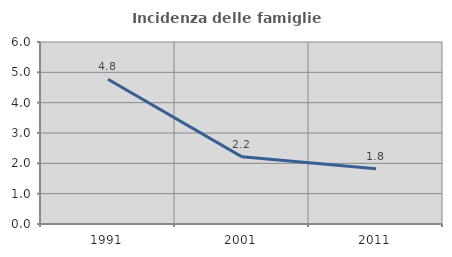
| Category | Incidenza delle famiglie numerose |
|---|---|
| 1991.0 | 4.773 |
| 2001.0 | 2.214 |
| 2011.0 | 1.825 |